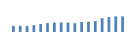
| Category | Exportações (1) |
|---|---|
| 0 | 203692.629 |
| 1 | 204985.899 |
| 2 | 199789.293 |
| 3 | 228223.553 |
| 4 | 265930.688 |
| 5 | 297441.741 |
| 6 | 313195.508 |
| 7 | 319331.634 |
| 8 | 313646.514 |
| 9 | 292708.824 |
| 10 | 335676.548 |
| 11 | 346139.442 |
| 12 | 364472.386 |
| 13 | 462235.534 |
| 14 | 497984.021 |
| 15 | 520796.798 |
| 16 | 520069.994 |